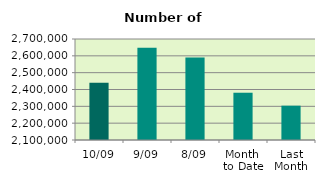
| Category | Series 0 |
|---|---|
| 10/09 | 2440256 |
| 9/09 | 2648724 |
| 8/09 | 2590598 |
| Month 
to Date | 2380813.25 |
| Last
Month | 2303894.727 |